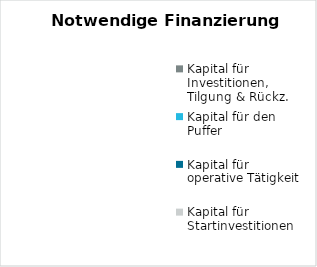
| Category | Kapital für Startinvestitionen | Kapital für operative Tätigkeit | Kapital für den Puffer | Kapital für Investitionen, Tilgung & Rückz. |
|---|---|---|---|---|
| 0 | 0 | 0 | 0 | 0 |